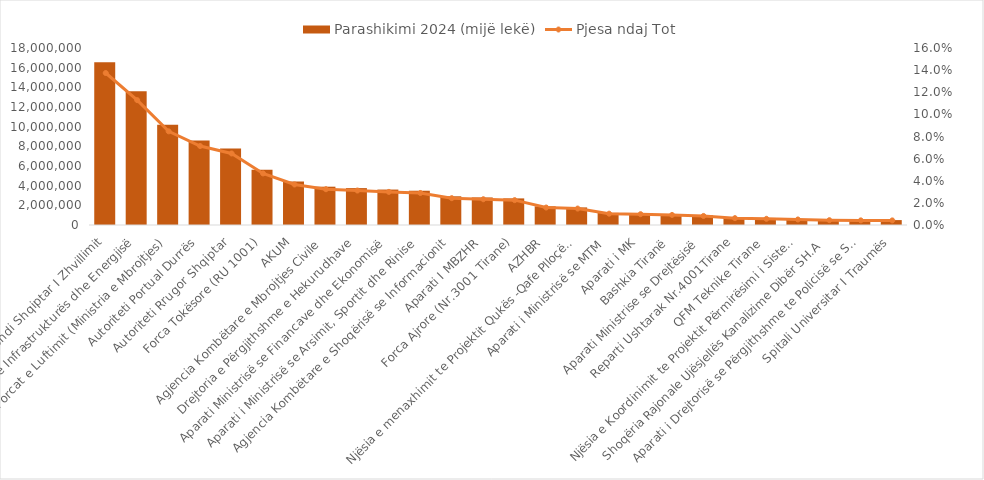
| Category | Parashikimi 2024 (mijë lekë) |
|---|---|
| Fondi Shqiptar I Zhvillimit | 16550000.001 |
| Aparati i Ministrisë se Infrastrukturës dhe Energjisë | 13596081 |
| Forcat e Luftimit (Ministria e Mbrojtjes) | 10200000 |
| Autoriteti Portual Durrës | 8600000 |
| Autoriteti Rrugor Shqiptar | 7790634 |
| Forca Tokësore (RU 1001) | 5614805 |
| AKUM | 4414033.085 |
| Agjencia Kombëtare e Mbrojtjes Civile | 3896050 |
| Drejtoria e Përgjithshme e Hekurudhave | 3752393 |
| Aparati Ministrisë se Financave dhe Ekonomisë | 3604152 |
| Aparati i Ministrisë se Arsimit, Sportit dhe Rinise | 3484764.128 |
| Agjencia Kombëtare e Shoqërisë se Informacionit | 2920000 |
| Aparati I MBZHR | 2803767 |
| Forca Ajrore (Nr.3001 Tirane) | 2706195 |
| AZHBR | 1901310 |
| Njësia e menaxhimit te Projektit Qukës -Qafe Plloçë financuar nga BIZH | 1789632 |
| Aparati i Ministrisë se MTM | 1232687 |
| Aparati i MK | 1177188 |
| Bashkia Tiranë | 1095312 |
| Aparati Ministrise se Drejtësisë | 985620 |
| Reparti Ushtarak Nr.4001Tirane | 747120 |
| QFM Teknike Tirane | 673695 |
| Njësia e Koordinimit te Projektit Përmirësimi i Sistemit te Shëndetësisë HSIP | 602000 |
| Shoqëria Rajonale Ujësjellës Kanalizime Dibër SH.A | 524057.213 |
| Aparati i Drejtorisë se Përgjithshme te Policisë se Shtetit | 503335 |
| Spitali Universitar I Traumës | 500000 |